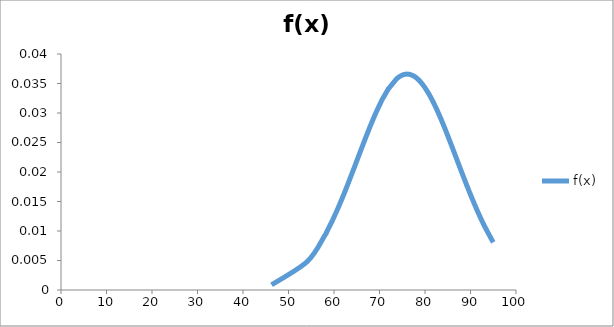
| Category | f(x) |
|---|---|
| 46.28 | 0.001 |
| 54.12 | 0.005 |
| 58.02 | 0.009 |
| 58.38 | 0.01 |
| 59.39 | 0.011 |
| 59.73 | 0.012 |
| 60.52 | 0.013 |
| 60.79 | 0.014 |
| 61.67 | 0.015 |
| 61.92 | 0.016 |
| 61.94 | 0.016 |
| 62.08 | 0.016 |
| 62.24 | 0.016 |
| 62.7 | 0.017 |
| 62.84 | 0.018 |
| 64.43 | 0.021 |
| 64.53 | 0.021 |
| 65.01 | 0.022 |
| 65.13 | 0.022 |
| 65.53 | 0.023 |
| 65.63 | 0.023 |
| 65.77 | 0.023 |
| 67.15 | 0.026 |
| 67.18 | 0.026 |
| 67.74 | 0.027 |
| 68.36 | 0.029 |
| 69.18 | 0.03 |
| 70.43 | 0.032 |
| 70.75 | 0.032 |
| 71.9 | 0.034 |
| 71.96 | 0.034 |
| 73.73 | 0.036 |
| 73.83 | 0.036 |
| 74.1 | 0.036 |
| 74.21 | 0.036 |
| 74.45 | 0.036 |
| 74.49 | 0.036 |
| 75.02 | 0.036 |
| 75.32 | 0.037 |
| 75.34 | 0.037 |
| 75.34 | 0.037 |
| 75.89 | 0.037 |
| 75.94 | 0.037 |
| 75.96 | 0.037 |
| 76.41 | 0.037 |
| 76.65 | 0.037 |
| 77.51 | 0.036 |
| 78.14 | 0.036 |
| 78.6 | 0.036 |
| 78.89 | 0.035 |
| 79.05 | 0.035 |
| 79.05 | 0.035 |
| 79.13 | 0.035 |
| 79.8 | 0.035 |
| 79.81 | 0.034 |
| 79.9 | 0.034 |
| 80.76 | 0.033 |
| 81.07 | 0.033 |
| 81.78 | 0.032 |
| 81.84 | 0.032 |
| 82.02 | 0.032 |
| 82.47 | 0.031 |
| 82.49 | 0.031 |
| 82.72 | 0.03 |
| 83.4 | 0.029 |
| 83.82 | 0.028 |
| 84.34 | 0.027 |
| 85.19 | 0.026 |
| 85.25 | 0.026 |
| 86.7 | 0.023 |
| 86.91 | 0.022 |
| 87.36 | 0.021 |
| 87.53 | 0.021 |
| 87.65 | 0.021 |
| 88.37 | 0.019 |
| 88.41 | 0.019 |
| 88.5 | 0.019 |
| 89.51 | 0.017 |
| 89.74 | 0.017 |
| 90.0 | 0.016 |
| 90.03 | 0.016 |
| 91.22 | 0.014 |
| 91.52 | 0.013 |
| 91.68 | 0.013 |
| 91.98 | 0.013 |
| 92.72 | 0.011 |
| 93.09 | 0.011 |
| 94.68 | 0.009 |
| 95.01 | 0.008 |